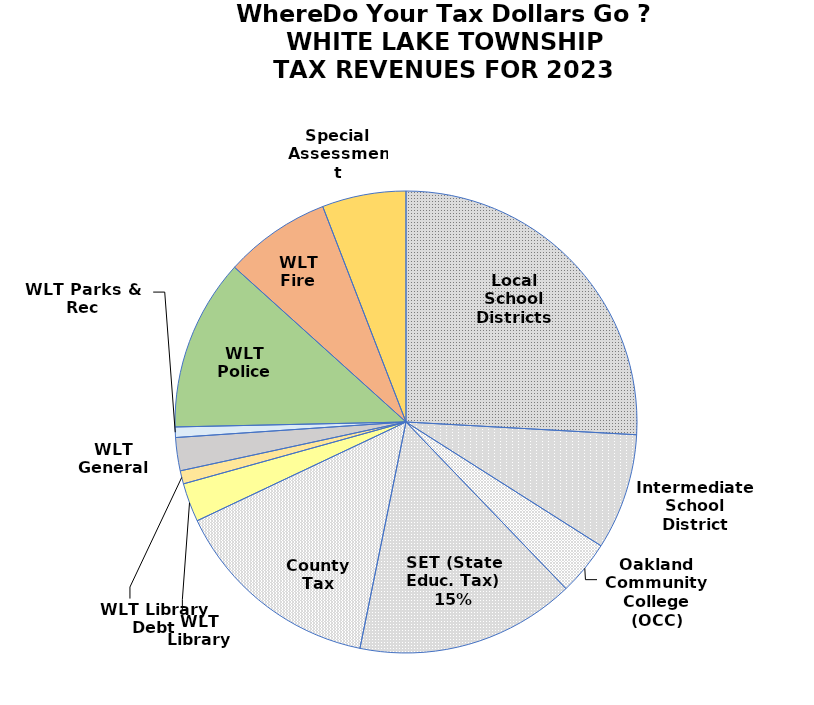
| Category | Series 0 | Series 1 |
|---|---|---|
| Local School Districts | 14887074.31 | 0.259 |
| Intermediate School District | 4672061.29 | 0.081 |
| Oakland Community College (OCC) | 2197597.39 | 0.038 |
| SET (State Educ. Tax) | 8842866.78 | 0.154 |
| County Tax | 8497023.83 | 0.148 |
| WLT Library | 1561425.18 | 0.027 |
| WLT Library Debt | 531681.11 | 0.009 |
| WLT General | 1333942.38 | 0.023 |
| WLT Parks & Rec | 419812 | 0.007 |
| WLT Police | 6917300.71 | 0.12 |
| WLT Fire | 4284508 | 0.074 |
| Special Assessment | 3376045.69 | 0.059 |